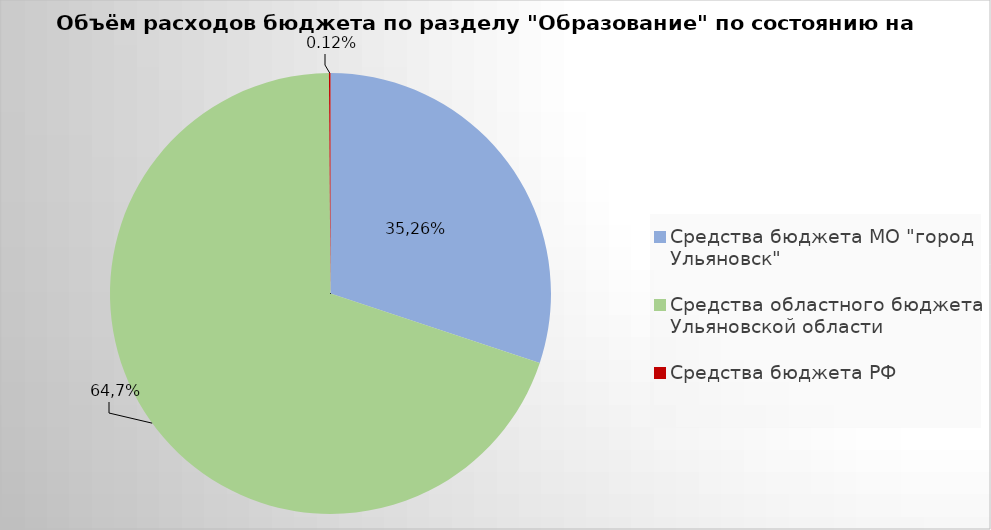
| Category | Series 0 |
|---|---|
| Средства бюджета МО "город Ульяновск" | 1651874.44 |
| Средства областного бюджета Ульяновской области | 3829486.99 |
| Средства бюджета РФ | 6206.2 |